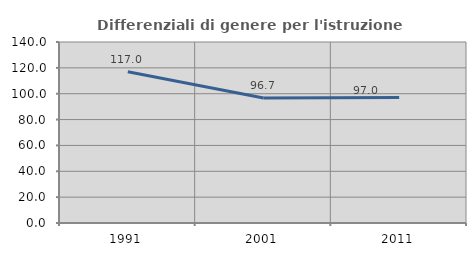
| Category | Differenziali di genere per l'istruzione superiore |
|---|---|
| 1991.0 | 116.962 |
| 2001.0 | 96.674 |
| 2011.0 | 97.006 |